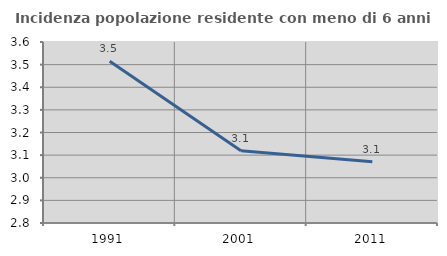
| Category | Incidenza popolazione residente con meno di 6 anni |
|---|---|
| 1991.0 | 3.515 |
| 2001.0 | 3.119 |
| 2011.0 | 3.071 |